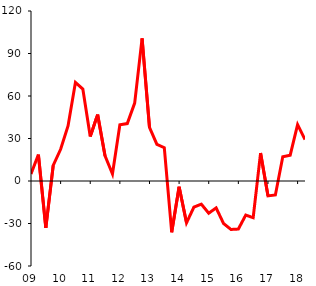
| Category | Series 0 |
|---|---|
| 2009-03-01 | 4.973 |
| 2009-06-01 | 18.668 |
| 2009-09-01 | -33.06 |
| 2009-12-01 | 10.988 |
| 2010-03-01 | 22.357 |
| 2010-06-01 | 38.813 |
| 2010-09-01 | 69.572 |
| 2010-12-01 | 64.872 |
| 2011-03-01 | 31.411 |
| 2011-06-01 | 46.863 |
| 2011-09-01 | 17.71 |
| 2011-12-01 | 4.951 |
| 2012-03-01 | 39.689 |
| 2012-06-01 | 40.558 |
| 2012-09-01 | 54.985 |
| 2012-12-01 | 100.661 |
| 2013-03-01 | 37.881 |
| 2013-06-01 | 25.933 |
| 2013-09-01 | 23.503 |
| 2013-12-01 | -36.211 |
| 2014-03-01 | -4.069 |
| 2014-06-01 | -29.518 |
| 2014-09-01 | -18.419 |
| 2014-12-01 | -16.349 |
| 2015-03-01 | -22.742 |
| 2015-06-01 | -18.986 |
| 2015-09-01 | -29.989 |
| 2015-12-01 | -34.205 |
| 2016-03-01 | -33.935 |
| 2016-06-01 | -24.058 |
| 2016-09-01 | -25.903 |
| 2016-12-01 | 19.721 |
| 2017-03-01 | -10.496 |
| 2017-06-01 | -9.874 |
| 2017-09-01 | 17.096 |
| 2017-12-01 | 18.251 |
| 2018-03-01 | 39.785 |
| 2018-06-01 | 29.263 |